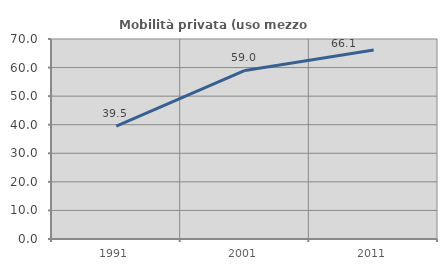
| Category | Mobilità privata (uso mezzo privato) |
|---|---|
| 1991.0 | 39.491 |
| 2001.0 | 58.994 |
| 2011.0 | 66.132 |